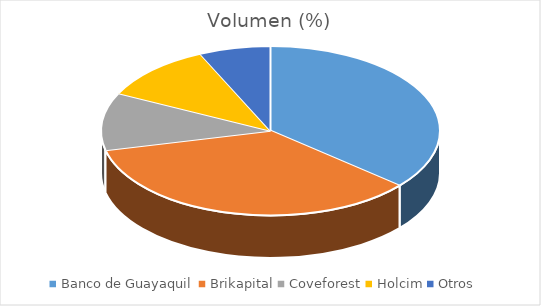
| Category | Volumen |
|---|---|
| Banco de Guayaquil | 20654 |
| Brikapital | 20000 |
| Coveforest | 6260.8 |
| Holcim | 6200 |
| Otros | 3889.6 |